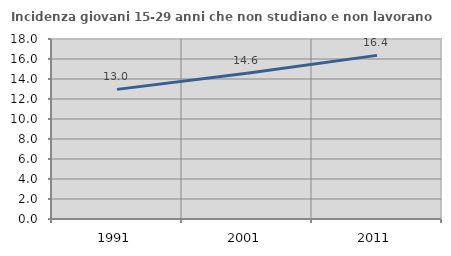
| Category | Incidenza giovani 15-29 anni che non studiano e non lavorano  |
|---|---|
| 1991.0 | 12.963 |
| 2001.0 | 14.57 |
| 2011.0 | 16.364 |